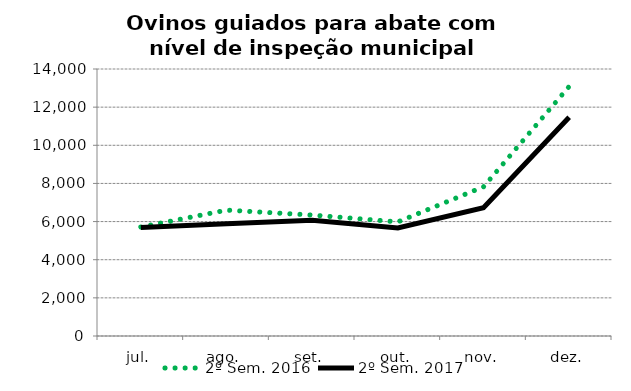
| Category | 2º Sem. 2016 | 2º Sem. 2017 |
|---|---|---|
| jul. | 5714 | 5688 |
| ago. | 6600 | 5888 |
| set. | 6342 | 6066 |
| out. | 5984 | 5664 |
| nov. | 7823 | 6728 |
| dez. | 13085 | 11469 |